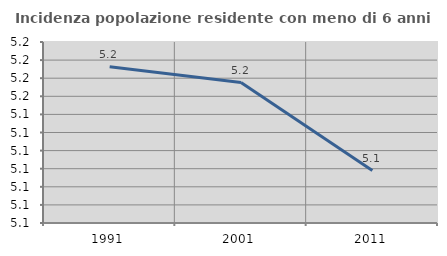
| Category | Incidenza popolazione residente con meno di 6 anni |
|---|---|
| 1991.0 | 5.166 |
| 2001.0 | 5.158 |
| 2011.0 | 5.109 |